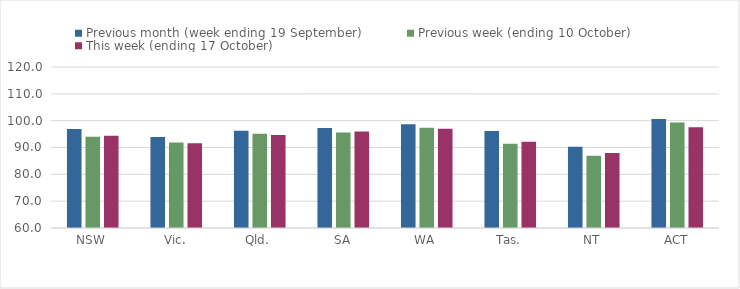
| Category | Previous month (week ending 19 September) | Previous week (ending 10 October) | This week (ending 17 October) |
|---|---|---|---|
| NSW | 96.92 | 94.03 | 94.36 |
| Vic. | 93.94 | 91.88 | 91.62 |
| Qld. | 96.27 | 95.09 | 94.62 |
| SA | 97.29 | 95.55 | 96 |
| WA | 98.67 | 97.4 | 97.01 |
| Tas. | 96.13 | 91.37 | 92.18 |
| NT | 90.24 | 86.91 | 87.95 |
| ACT | 100.58 | 99.31 | 97.52 |